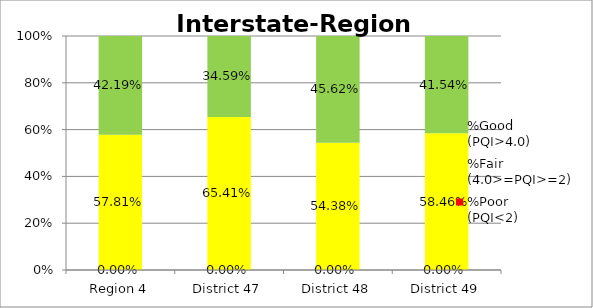
| Category | %Poor
(PQI<2) | %Fair
(4.0>=PQI>=2) | %Good
(PQI>4.0) |
|---|---|---|---|
| Region 4 | 0 | 0.578 | 0.422 |
| District 47 | 0 | 0.654 | 0.346 |
| District 48 | 0 | 0.544 | 0.456 |
| District 49 | 0 | 0.585 | 0.415 |